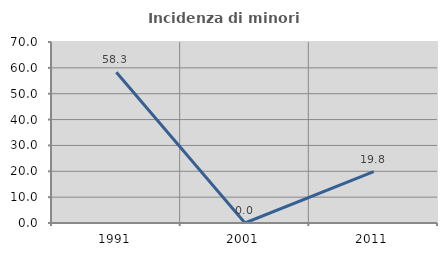
| Category | Incidenza di minori stranieri |
|---|---|
| 1991.0 | 58.333 |
| 2001.0 | 0 |
| 2011.0 | 19.847 |